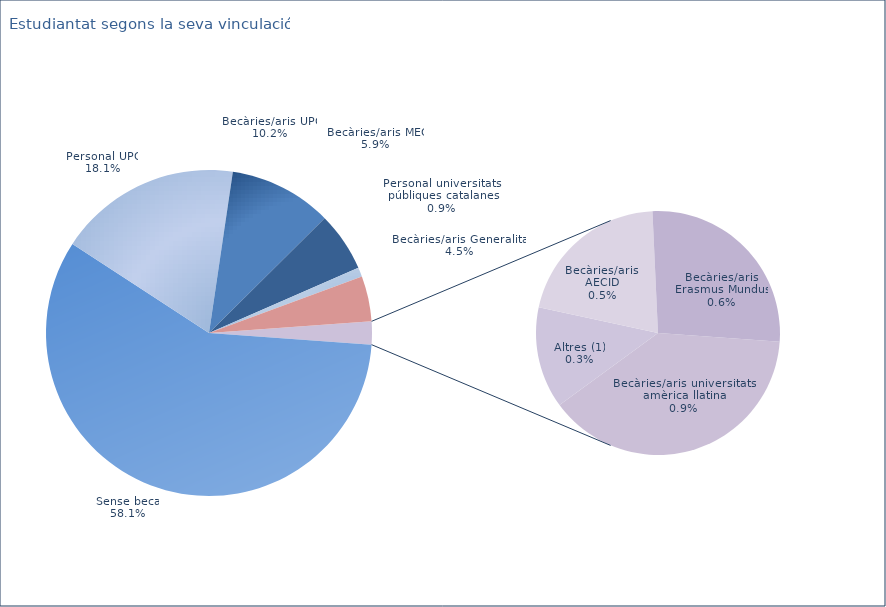
| Category | Series 0 |
|---|---|
| Sense beca | 1705 |
| Personal UPC | 533 |
| Becàries/aris UPC | 300 |
| Becàries/aris MEC | 173 |
| Personal universitats 
públiques catalanes | 27 |
| Becàries/aris Generalitat | 132 |
| Becàries/aris universitats 
amèrica llatina | 26 |
| Altres (1) | 9 |
| Becàries/aris 
AECID | 14 |
| Becàries/aris 
Erasmus Mundus | 18 |